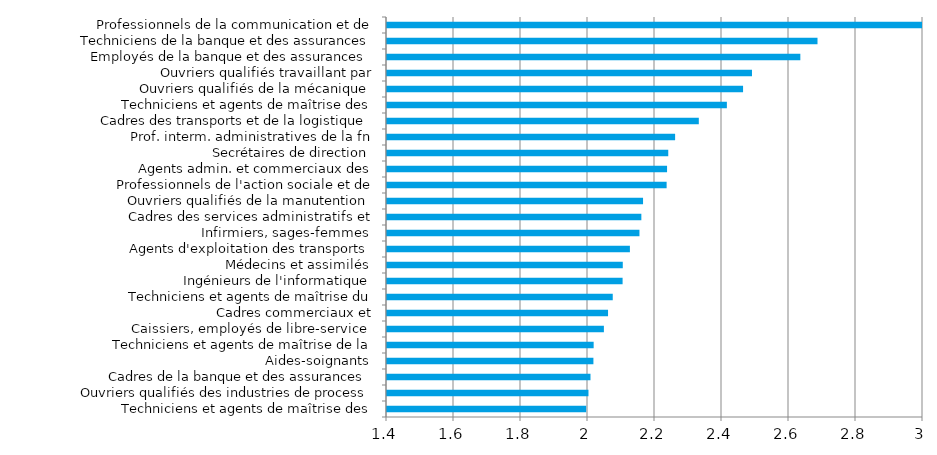
| Category | Series 0 |
|---|---|
| Techniciens et agents de maîtrise des industries mécaniques | 1.995 |
| Ouvriers qualifiés des industries de process | 2.001 |
| Cadres de la banque et des assurances | 2.007 |
| Aides-soignants | 2.016 |
| Techniciens et agents de maîtrise de la maintenance | 2.017 |
| Caissiers, employés de libre-service | 2.047 |
| Cadres commerciaux et technico-commerciaux | 2.06 |
| Techniciens et agents de maîtrise du bâtiment et travaux publics | 2.074 |
| Ingénieurs de l'informatique | 2.103 |
| Médecins et assimilés | 2.104 |
| Agents d'exploitation des transports | 2.125 |
| Infirmiers, sages-femmes | 2.154 |
| Cadres des services administratifs et comptables | 2.159 |
| Ouvriers qualifiés de la manutention | 2.164 |
| Professionnels de l'action sociale et de l'orientation | 2.235 |
| Agents admin. et commerciaux des transports et du tourisme | 2.236 |
| Secrétaires de direction | 2.24 |
| Prof. interm. administratives de la fn publique (cat. B et assimilés) | 2.26 |
| Cadres des transports et de la logistique | 2.331 |
| Techniciens et agents de maîtrise des industries de process | 2.415 |
| Ouvriers qualifiés de la mécanique | 2.463 |
| Ouvriers qualifiés travaillant par enlèvement de métal | 2.489 |
| Employés de la banque et des assurances | 2.634 |
| Techniciens de la banque et des assurances | 2.685 |
| Professionnels de la communication et de l'information | 3.022 |